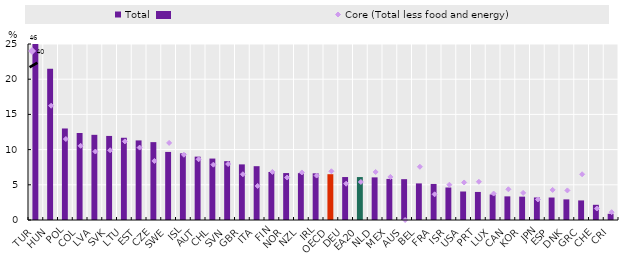
| Category | Total |
|---|---|
| TUR | 39.585 |
| HUN | 21.5 |
| POL | 13 |
| COL | 12.36 |
| LVA | 12.098 |
| SVK | 11.941 |
| LTU | 11.681 |
| EST | 11.306 |
| CZE | 11.061 |
| SWE | 9.669 |
| ISL | 9.467 |
| AUT | 9 |
| CHL | 8.727 |
| SVN | 8.356 |
| GBR | 7.9 |
| ITA | 7.644 |
| FIN | 6.82 |
| NOR | 6.667 |
| NZL | 6.655 |
| IRL | 6.631 |
| OECD | 6.506 |
| DEU | 6.102 |
| EA20 | 6.1 |
| NLD | 6.056 |
| MEX | 5.835 |
| AUS | 5.8 |
| BEL | 5.198 |
| FRA | 5.12 |
| ISR | 4.618 |
| USA | 4.048 |
| PRT | 3.985 |
| LUX | 3.625 |
| CAN | 3.357 |
| KOR | 3.319 |
| JPN | 3.2 |
| ESP | 3.193 |
| DNK | 2.928 |
| GRC | 2.782 |
| CHE | 2.159 |
| CRI | 0.879 |